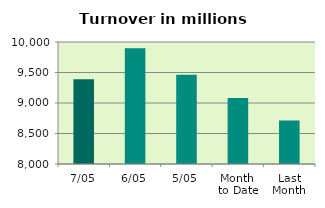
| Category | Series 0 |
|---|---|
| 7/05 | 9389.788 |
| 6/05 | 9896.436 |
| 5/05 | 9464.456 |
| Month 
to Date | 9079.998 |
| Last
Month | 8713.977 |